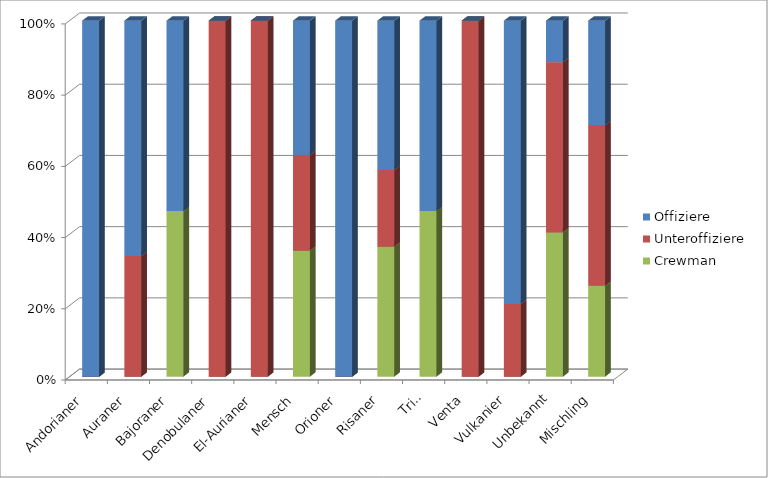
| Category | Crewman | Unteroffiziere | Offiziere |
|---|---|---|---|
| Andorianer | 0 | 0 | 0.1 |
| Auraner | 0 | 0.026 | 0.05 |
| Bajoraner | 0.043 | 0 | 0.05 |
| Denobulaner | 0 | 0.026 | 0 |
| El-Aurianer | 0 | 0.026 | 0 |
| Mensch | 0.609 | 0.462 | 0.65 |
| Orioner | 0 | 0 | 0.05 |
| Risaner | 0.043 | 0.026 | 0.05 |
| Trill | 0.043 | 0 | 0.05 |
| Venta | 0 | 0.026 | 0 |
| Vulkanier | 0 | 0.051 | 0.2 |
| Unbekannt | 0.174 | 0.205 | 0.05 |
| Mischling | 0.087 | 0.154 | 0.1 |